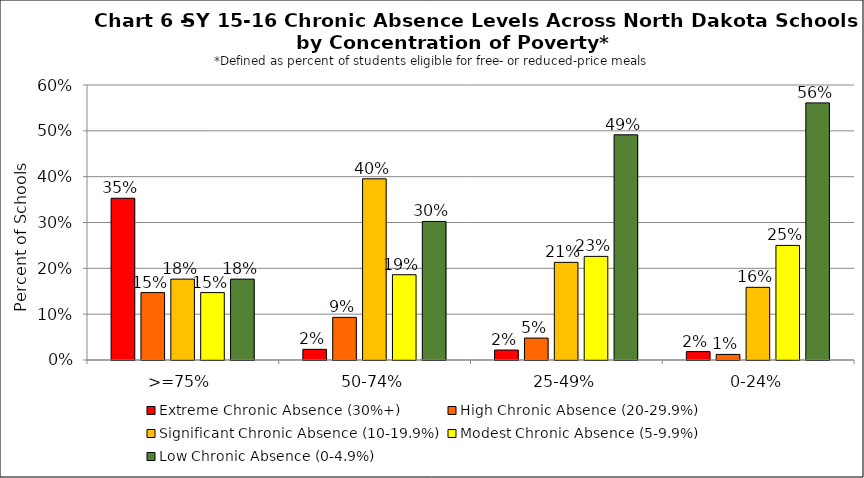
| Category | Extreme Chronic Absence (30%+) | High Chronic Absence (20-29.9%) | Significant Chronic Absence (10-19.9%) | Modest Chronic Absence (5-9.9%) | Low Chronic Absence (0-4.9%) |
|---|---|---|---|---|---|
| 0 | 0.353 | 0.147 | 0.176 | 0.147 | 0.176 |
| 1 | 0.023 | 0.093 | 0.395 | 0.186 | 0.302 |
| 2 | 0.022 | 0.048 | 0.213 | 0.226 | 0.491 |
| 3 | 0.018 | 0.012 | 0.159 | 0.25 | 0.561 |